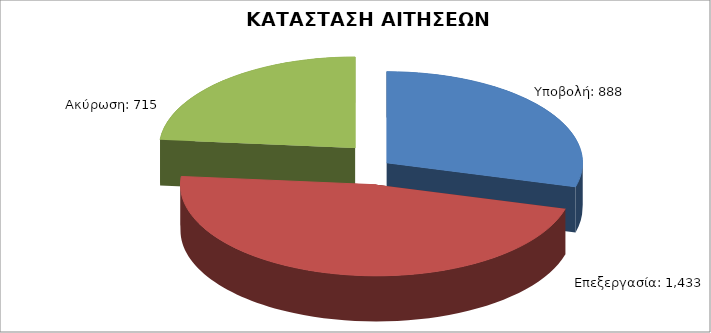
| Category | Series 0 |
|---|---|
| Υποβολή: | 888 |
| Επεξεργασία: | 1433 |
| Ακύρωση: | 715 |